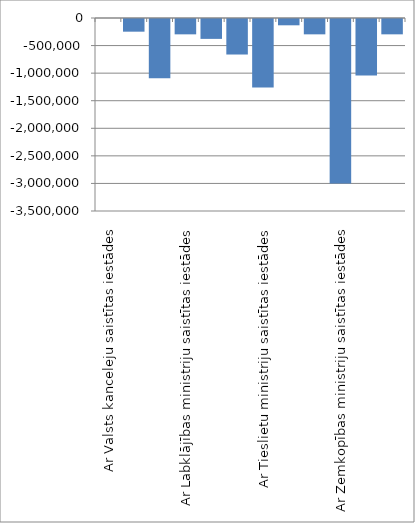
| Category | Series 0 |
|---|---|
| Ar Valsts kanceleju saistītas iestādes | 0 |
| Ar Ārlietu ministriju saistītās iestādes | -229977.107 |
| Ar Finanšu ministriju saistītas iestādes | -1072363.853 |
| Ar Labklājības ministriju saistītas iestādes | -278175.695 |
| Ar Ekonomikas ministriju saistītas iestādes | -360603.755 |
| Ar Veselības ministriju saistītas iestādes | -644069.062 |
| Ar Tieslietu ministriju saistītas iestādes | -1243389.648 |
|  Ar Reģionālās un pašvaldību lietu ministriju saistītas iestādes | -114342.66 |
| Ar Izglītības un zinātnes ministriju saistītas iestādes | -278197.123 |
| Ar Zemkopības ministriju saistītas iestādes | -2981988.96 |
| Ar Vides ministriju saistītas iestādes | -1026024.534 |
| Ar Aizsardzības ministriju saistītās iestādes | -278071.56 |